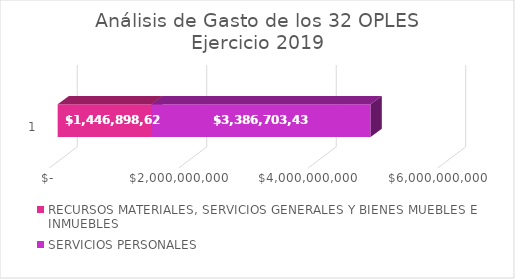
| Category | RECURSOS MATERIALES, SERVICIOS GENERALES Y BIENES MUEBLES E INMUEBLES | SERVICIOS PERSONALES  |
|---|---|---|
| 0 | 1446898626.98 | 3386703437.46 |